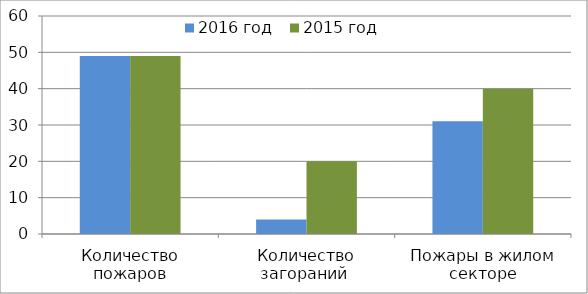
| Category | 2016 год | 2015 год |
|---|---|---|
| Количество пожаров | 49 | 49 |
| Количество загораний  | 4 | 20 |
| Пожары в жилом секторе | 31 | 40 |